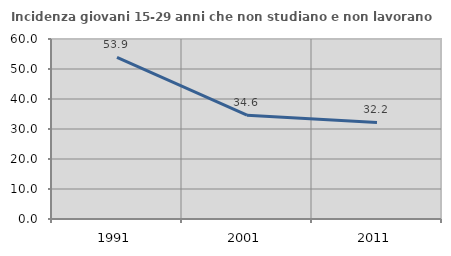
| Category | Incidenza giovani 15-29 anni che non studiano e non lavorano  |
|---|---|
| 1991.0 | 53.915 |
| 2001.0 | 34.601 |
| 2011.0 | 32.184 |